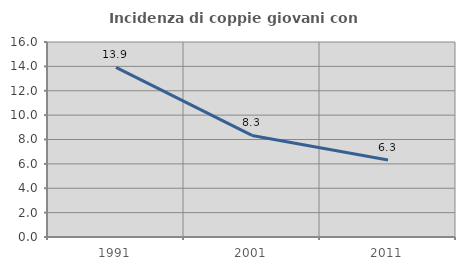
| Category | Incidenza di coppie giovani con figli |
|---|---|
| 1991.0 | 13.918 |
| 2001.0 | 8.333 |
| 2011.0 | 6.316 |